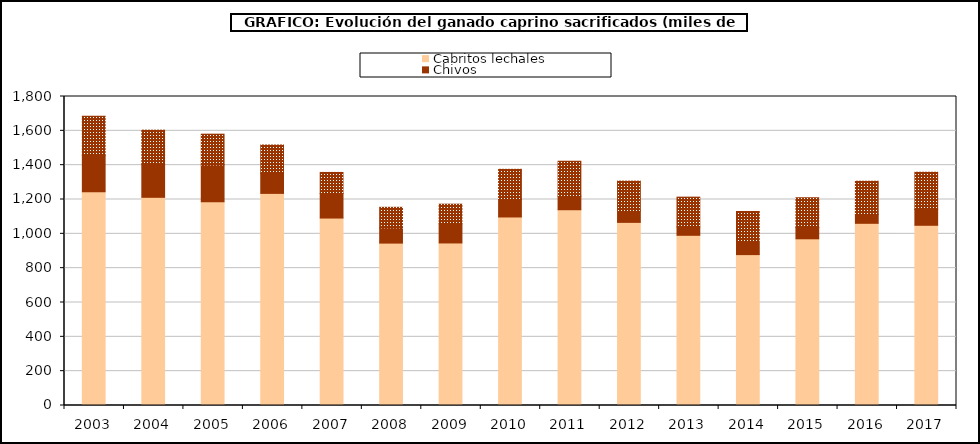
| Category | Cabritos | Chivos | Mayor |
|---|---|---|---|
| 2003.0 | 1245.325 | 212.255 | 227.066 |
| 2004.0 | 1212.757 | 193.057 | 197.929 |
| 2005.0 | 1187.568 | 213.586 | 179.395 |
| 2006.0 | 1235.634 | 116.214 | 165.659 |
| 2007.0 | 1091.939 | 142.795 | 123.018 |
| 2008.0 | 946.005 | 88.612 | 119.891 |
| 2009.0 | 946.871 | 111.232 | 114.664 |
| 2010.0 | 1098.192 | 101.913 | 175.759 |
| 2011.0 | 1140.362 | 79.178 | 203.056 |
| 2012.0 | 1066.793 | 67.733 | 172.561 |
| 2013.0 | 991.445 | 48.941 | 173.365 |
| 2014.0 | 878.99 | 82.198 | 169.027 |
| 2015.0 | 971.043 | 66.091 | 173.135 |
| 2016.0 | 1061.299 | 51.43 | 193.715 |
| 2017.0 | 1049.788 | 91.752 | 216.862 |